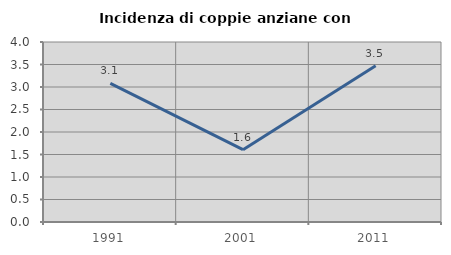
| Category | Incidenza di coppie anziane con figli |
|---|---|
| 1991.0 | 3.082 |
| 2001.0 | 1.608 |
| 2011.0 | 3.47 |